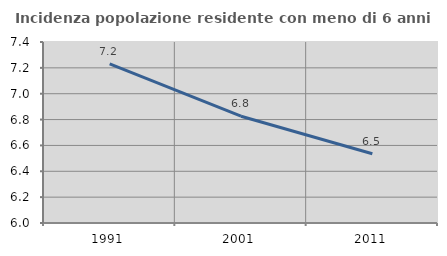
| Category | Incidenza popolazione residente con meno di 6 anni |
|---|---|
| 1991.0 | 7.23 |
| 2001.0 | 6.826 |
| 2011.0 | 6.536 |